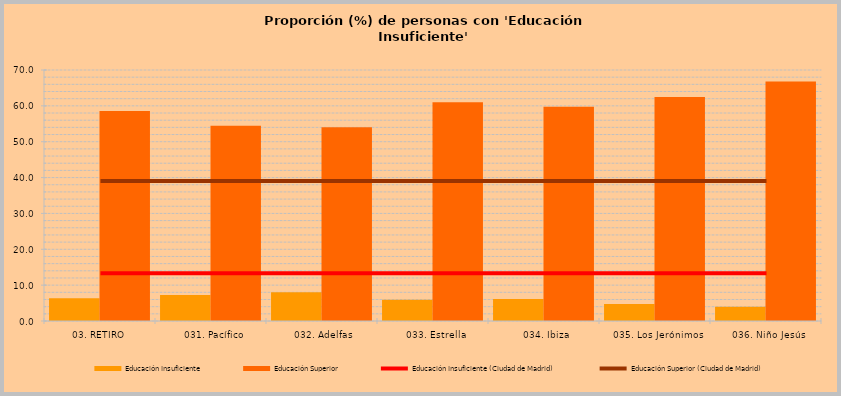
| Category | Educación Insuficiente | Educación Superior |
|---|---|---|
|  03. RETIRO | 6.347 | 58.593 |
|    031. Pacífico | 7.22 | 54.482 |
|    032. Adelfas | 7.99 | 54.002 |
|    033. Estrella | 5.903 | 61.028 |
|    034. Ibiza | 6.126 | 59.77 |
|    035. Los Jerónimos | 4.755 | 62.505 |
|    036. Niño Jesús | 3.946 | 66.804 |